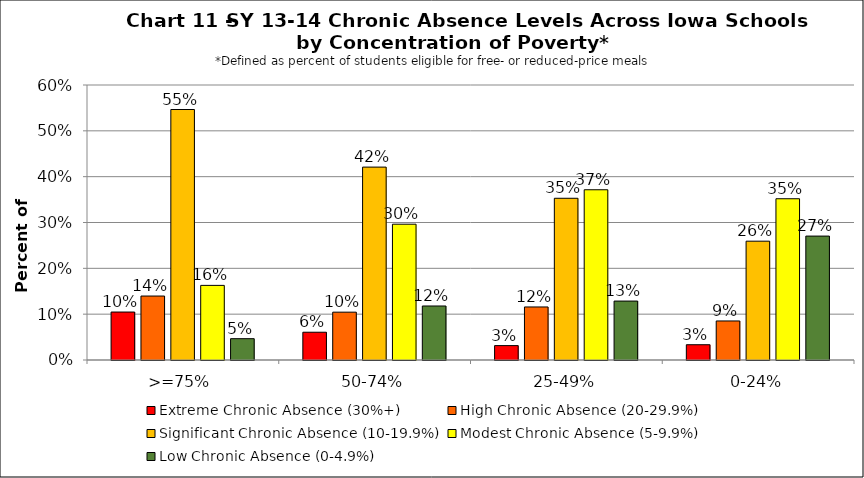
| Category | Extreme Chronic Absence (30%+) | High Chronic Absence (20-29.9%) | Significant Chronic Absence (10-19.9%) | Modest Chronic Absence (5-9.9%) | Low Chronic Absence (0-4.9%) |
|---|---|---|---|---|---|
| 0 | 0.105 | 0.14 | 0.547 | 0.163 | 0.047 |
| 1 | 0.061 | 0.104 | 0.421 | 0.296 | 0.118 |
| 2 | 0.031 | 0.116 | 0.353 | 0.371 | 0.129 |
| 3 | 0.033 | 0.085 | 0.259 | 0.352 | 0.27 |